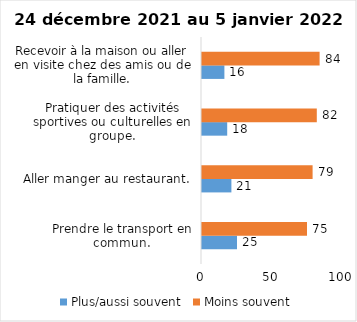
| Category | Plus/aussi souvent | Moins souvent |
|---|---|---|
| Prendre le transport en commun. | 25 | 75 |
| Aller manger au restaurant. | 21 | 79 |
| Pratiquer des activités sportives ou culturelles en groupe. | 18 | 82 |
| Recevoir à la maison ou aller en visite chez des amis ou de la famille. | 16 | 84 |